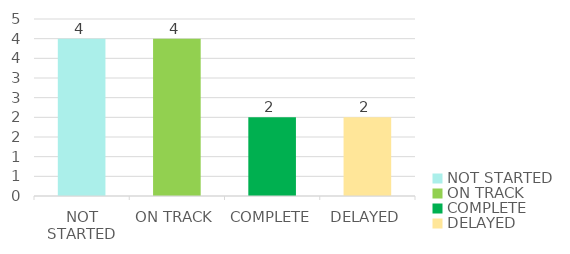
| Category | Series 0 |
|---|---|
| NOT STARTED | 4 |
| ON TRACK | 4 |
| COMPLETE | 2 |
| DELAYED | 2 |